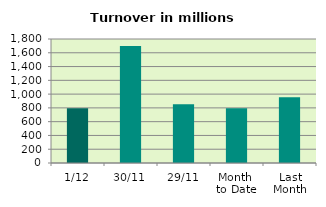
| Category | Series 0 |
|---|---|
| 1/12 | 795.529 |
| 30/11 | 1698.798 |
| 29/11 | 854.531 |
| Month 
to Date | 795.529 |
| Last
Month | 954.978 |